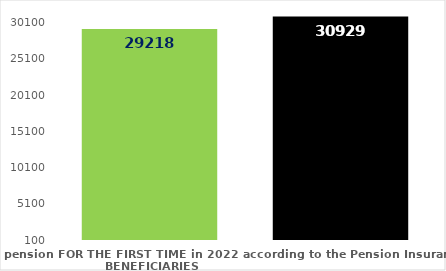
| Category | broj korisnika |
|---|---|
| Pension beneficiaries entitled to pension FOR THE FIRST TIME in 2022 according to the Pension Insurance Act  - NEW BENEFICIARIES | 29218 |
| Pension beneficiaries whose pension entitlement ceased in 2022  -  death caused,   
and who were retired according to the Pension Insurance Act   | 30929 |